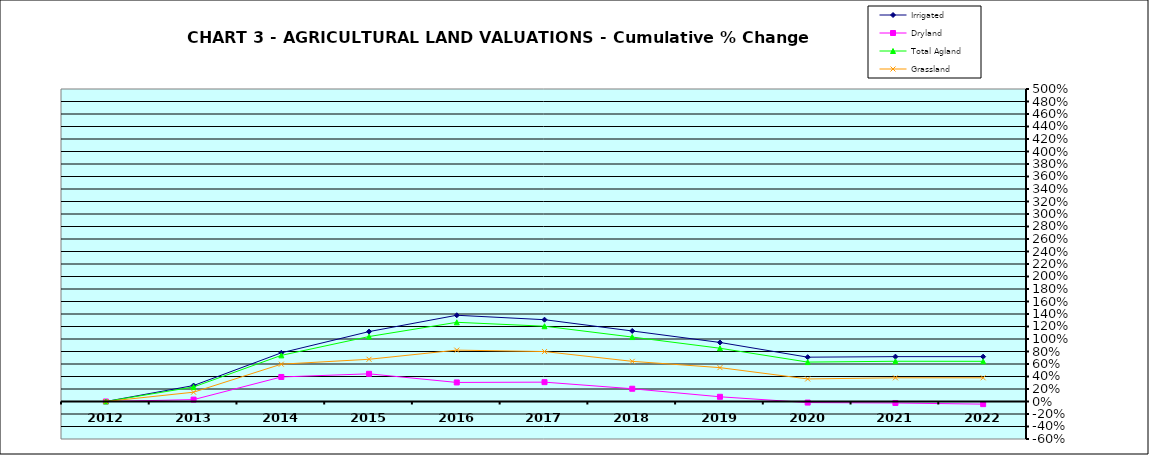
| Category | Irrigated | Dryland | Total Agland | Grassland |
|---|---|---|---|---|
| 2012.0 | 0 | 0 | 0 | 0 |
| 2013.0 | 0.255 | 0.03 | 0.233 | 0.149 |
| 2014.0 | 0.779 | 0.393 | 0.738 | 0.597 |
| 2015.0 | 1.118 | 0.443 | 1.039 | 0.676 |
| 2016.0 | 1.38 | 0.305 | 1.267 | 0.822 |
| 2017.0 | 1.309 | 0.31 | 1.205 | 0.799 |
| 2018.0 | 1.128 | 0.204 | 1.031 | 0.643 |
| 2019.0 | 0.945 | 0.075 | 0.852 | 0.542 |
| 2020.0 | 0.709 | -0.017 | 0.631 | 0.361 |
| 2021.0 | 0.718 | -0.024 | 0.644 | 0.379 |
| 2022.0 | 0.718 | -0.042 | 0.643 | 0.379 |